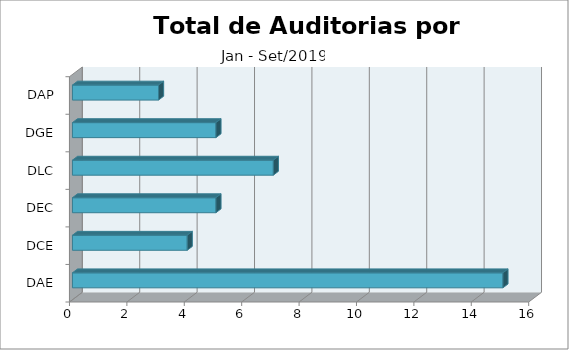
| Category | TOTAL |
|---|---|
| DAE | 15 |
| DCE | 4 |
| DEC | 5 |
| DLC | 7 |
| DGE | 5 |
| DAP | 3 |